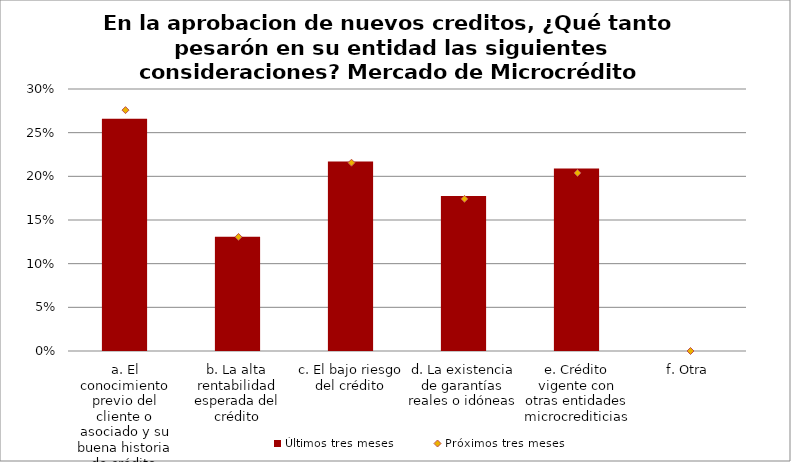
| Category | Últimos tres meses |
|---|---|
| a. El conocimiento previo del cliente o asociado y su buena historia de crédito | 0.266 |
| b. La alta rentabilidad esperada del crédito | 0.131 |
| c. El bajo riesgo del crédito | 0.217 |
| d. La existencia de garantías reales o idóneas | 0.178 |
| e. Crédito vigente con otras entidades microcrediticias | 0.209 |
| f. Otra | 0 |